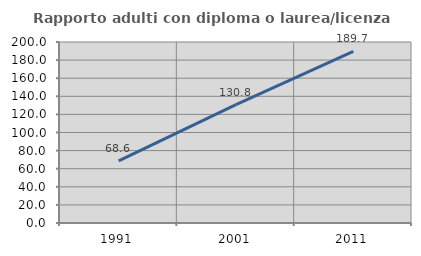
| Category | Rapporto adulti con diploma o laurea/licenza media  |
|---|---|
| 1991.0 | 68.571 |
| 2001.0 | 130.769 |
| 2011.0 | 189.744 |